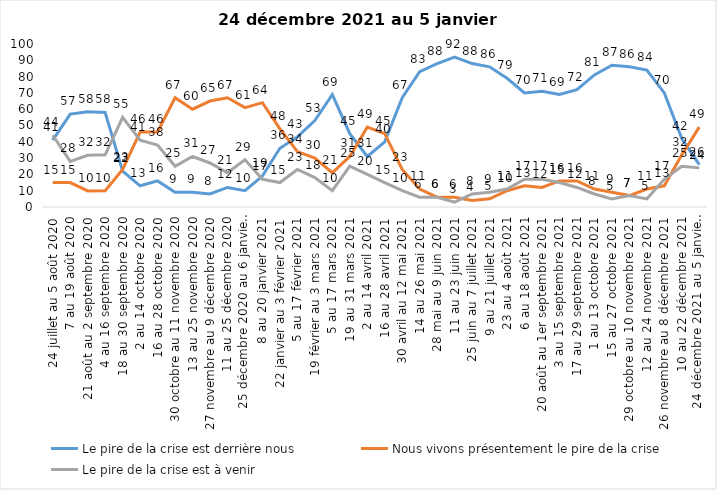
| Category | Le pire de la crise est derrière nous | Nous vivons présentement le pire de la crise | Le pire de la crise est à venir |
|---|---|---|---|
| 24 juillet au 5 août 2020 | 41 | 15 | 44 |
| 7 au 19 août 2020 | 57 | 15 | 28 |
| 21 août au 2 septembre 2020 | 58.39 | 9.84 | 31.77 |
| 4 au 16 septembre 2020 | 58 | 10 | 32 |
| 18 au 30 septembre 2020 | 22 | 23 | 55 |
| 2 au 14 octobre 2020 | 13 | 46 | 41 |
| 16 au 28 octobre 2020 | 16 | 46 | 38 |
| 30 octobre au 11 novembre 2020 | 9 | 67 | 25 |
| 13 au 25 novembre 2020 | 9 | 60 | 31 |
| 27 novembre au 9 décembre 2020 | 8 | 65 | 27 |
| 11 au 25 décembre 2020 | 12 | 67 | 21 |
| 25 décembre 2020 au 6 janvier 2021 | 10 | 61 | 29 |
| 8 au 20 janvier 2021 | 19 | 64 | 17 |
| 22 janvier au 3 février 2021 | 36 | 48 | 15 |
| 5 au 17 février 2021 | 43 | 34 | 23 |
| 19 février au 3 mars 2021 | 53 | 30 | 18 |
| 5 au 17 mars 2021 | 69 | 21 | 10 |
| 19 au 31 mars 2021 | 45 | 31 | 25 |
| 2 au 14 avril 2021 | 31 | 49 | 20 |
| 16 au 28 avril 2021 | 40 | 45 | 15 |
| 30 avril au 12 mai 2021 | 67 | 23 | 10 |
| 14 au 26 mai 2021 | 83 | 11 | 6 |
| 28 mai au 9 juin 2021 | 88 | 6 | 6 |
| 11 au 23 juin 2021 | 92 | 6 | 3 |
| 25 juin au 7 juillet 2021 | 88 | 4 | 8 |
| 9 au 21 juillet 2021 | 86 | 5 | 9 |
| 23 au 4 août 2021 | 79 | 10 | 11 |
| 6 au 18 août 2021 | 70 | 13 | 17 |
| 20 août au 1er septembre 2021 | 71 | 12 | 17 |
| 3 au 15 septembre 2021 | 69 | 16 | 15 |
| 17 au 29 septembre 2021 | 72 | 16 | 12 |
| 1 au 13 octobre 2021 | 81 | 11 | 8 |
| 15 au 27 octobre 2021 | 87 | 9 | 5 |
| 29 octobre au 10 novembre 2021 | 86 | 7 | 7 |
| 12 au 24 novembre 2021 | 84 | 11 | 5 |
| 26 novembre au 8 décembre 2021 | 70 | 13 | 17 |
| 10 au 22 décembre 2021 | 42 | 32 | 25 |
| 24 décembre 2021 au 5 janvier 2022 | 26 | 49 | 24 |